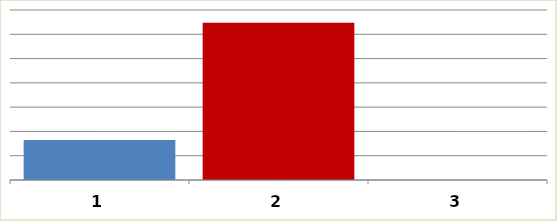
| Category | Series 0 |
|---|---|
| 0 | 16457789.21 |
| 1 | 64742925 |
| 2 | 0 |